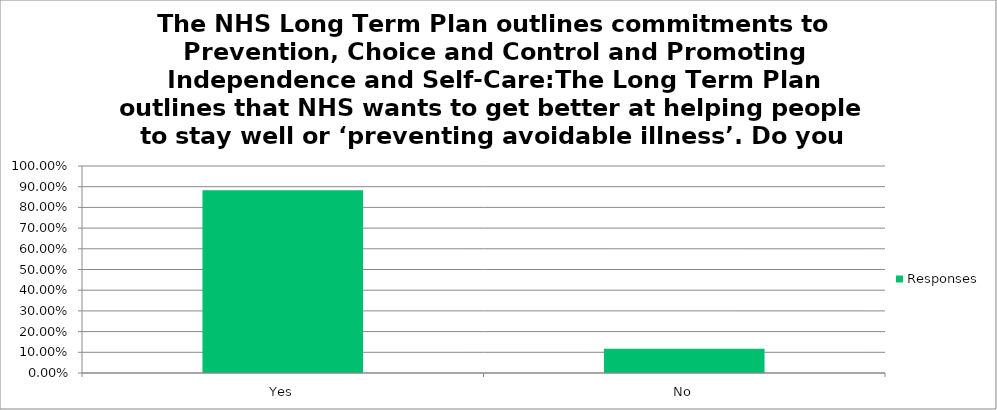
| Category | Responses |
|---|---|
| Yes | 0.883 |
| No | 0.117 |